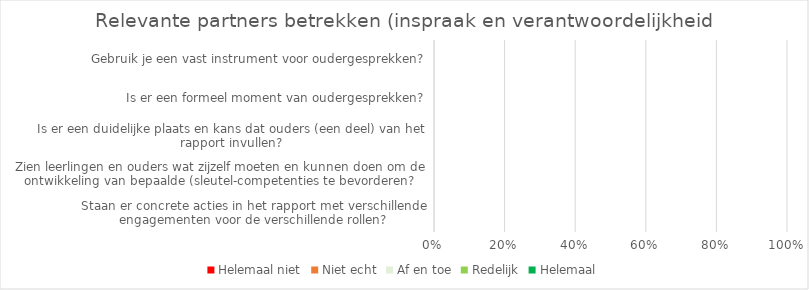
| Category | Helemaal niet | Niet echt | Af en toe | Redelijk | Helemaal |
|---|---|---|---|---|---|
| Staan er concrete acties in het rapport met verschillende engagementen voor de verschillende rollen? | 0 | 0 | 0 | 0 | 0 |
| Zien leerlingen en ouders wat zijzelf moeten en kunnen doen om de ontwikkeling van bepaalde (sleutel-competenties te bevorderen? | 0 | 0 | 0 | 0 | 0 |
| Is er een duidelijke plaats en kans dat ouders (een deel) van het rapport invullen? | 0 | 0 | 0 | 0 | 0 |
| Is er een formeel moment van oudergesprekken? | 0 | 0 | 0 | 0 | 0 |
| Gebruik je een vast instrument voor oudergesprekken? | 0 | 0 | 0 | 0 | 0 |